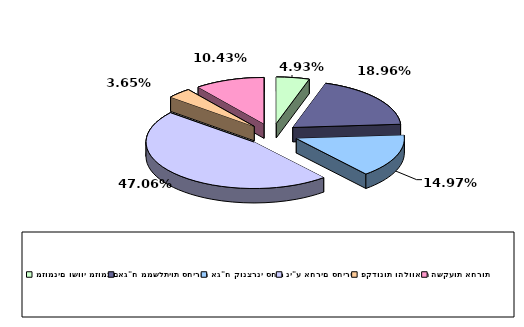
| Category | Series 0 |
|---|---|
| מזומנים ושווי מזומנים | 0.049 |
| אג"ח ממשלתיות סחירות | 0.19 |
| אג"ח קונצרני סחיר | 0.15 |
| ני"ע אחרים סחירים | 0.471 |
| פקדונות והלוואות | 0.037 |
| השקעות אחרות | 0.104 |